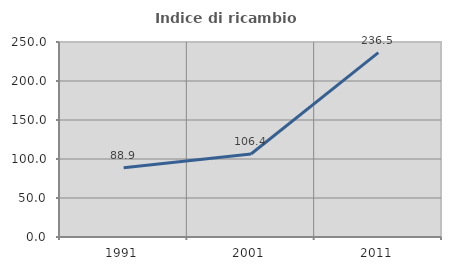
| Category | Indice di ricambio occupazionale  |
|---|---|
| 1991.0 | 88.889 |
| 2001.0 | 106.4 |
| 2011.0 | 236.471 |